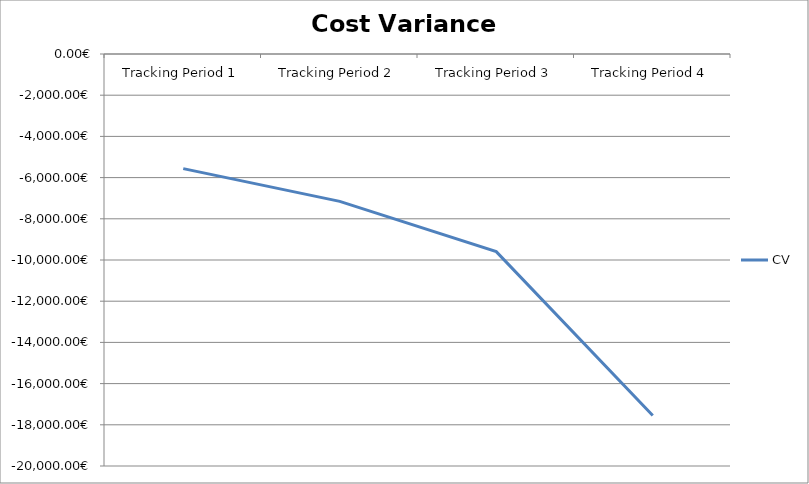
| Category | CV |
|---|---|
| Tracking Period 1 | -5565 |
| Tracking Period 2 | -7153 |
| Tracking Period 3 | -9595 |
| Tracking Period 4 | -17547 |